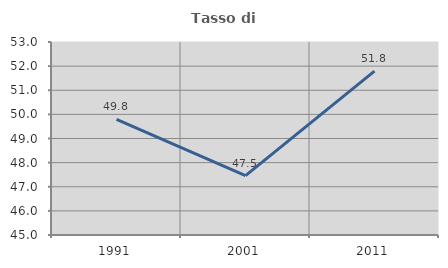
| Category | Tasso di occupazione   |
|---|---|
| 1991.0 | 49.796 |
| 2001.0 | 47.458 |
| 2011.0 | 51.793 |